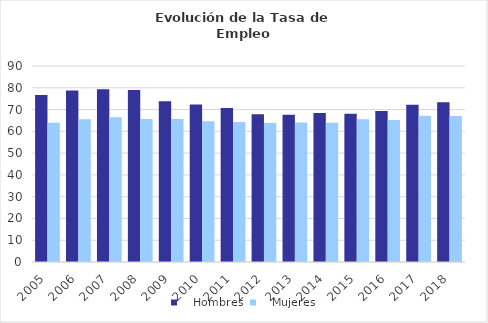
| Category |    Hombres |    Mujeres |
|---|---|---|
| 2005.0 | 76.686 | 63.964 |
| 2006.0 | 78.793 | 65.493 |
| 2007.0 | 79.34 | 66.517 |
| 2008.0 | 78.937 | 65.634 |
| 2009.0 | 73.821 | 65.613 |
| 2010.0 | 72.309 | 64.668 |
| 2011.0 | 70.705 | 64.336 |
| 2012.0 | 67.856 | 63.848 |
| 2013.0 | 67.67 | 64.004 |
| 2014.0 | 68.376 | 63.963 |
| 2015.0 | 68.074 | 65.543 |
| 2016.0 | 69.373 | 65.207 |
| 2017.0 | 72.159 | 67.165 |
| 2018.0 | 73.411 | 67.052 |